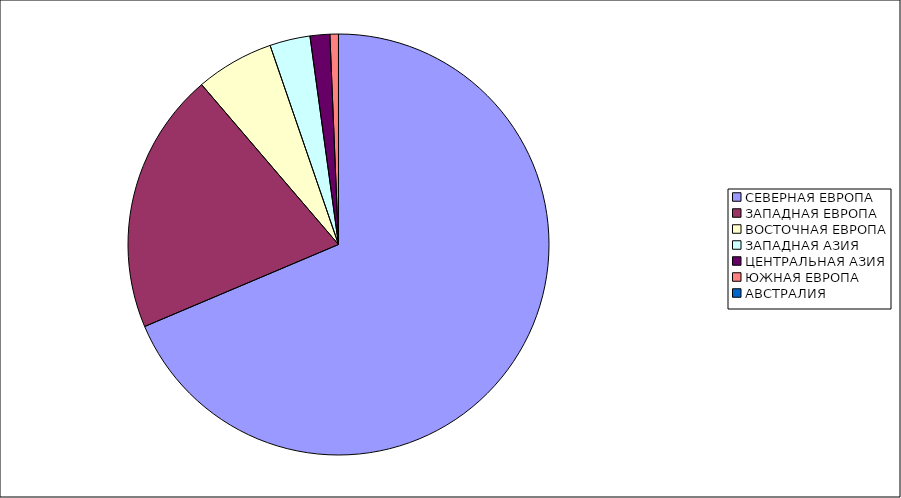
| Category | Оборот |
|---|---|
| СЕВЕРНАЯ ЕВРОПА | 68.628 |
| ЗАПАДНАЯ ЕВРОПА | 20.102 |
| ВОСТОЧНАЯ ЕВРОПА | 6.004 |
| ЗАПАДНАЯ АЗИЯ | 3.1 |
| ЦЕНТРАЛЬНАЯ АЗИЯ | 1.513 |
| ЮЖНАЯ ЕВРОПА | 0.652 |
| АВСТРАЛИЯ | 0.002 |